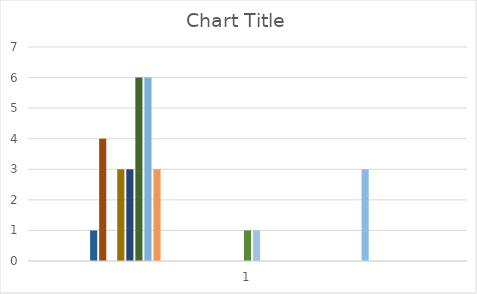
| Category | Series 0 | Series 1 | Series 2 | Series 3 | Series 4 | Series 5 | Series 6 | Series 7 | Series 8 | Series 9 | Series 10 | Series 11 | Series 12 | Series 13 | Series 14 | Series 15 | Series 16 | Series 17 | Series 18 | Series 19 | Series 20 | Series 21 | Series 22 | Series 23 | Series 24 | Series 25 | Series 26 | Series 27 | Series 28 | Series 29 | Series 30 | Series 31 | Series 32 | Series 33 | Series 34 | Series 35 | Series 36 | Series 37 | Series 38 | Series 39 | Series 40 | Series 41 | Series 42 | Series 43 | Series 44 | Series 45 | Series 46 |
|---|---|---|---|---|---|---|---|---|---|---|---|---|---|---|---|---|---|---|---|---|---|---|---|---|---|---|---|---|---|---|---|---|---|---|---|---|---|---|---|---|---|---|---|---|---|---|---|
| 0 | 0 | 0 | 0 | 0 | 0 | 0 | 1 | 4 | 0 | 3 | 3 | 6 | 6 | 3 | 0 | 0 | 0 | 0 | 0 | 0 | 0 | 0 | 0 | 1 | 1 | 0 | 0 | 0 | 0 | 0 | 0 | 0 | 0 | 0 | 0 | 0 | 3 | 0 | 0 | 0 | 0 | 0 | 0 | 0 | 0 | 0 | 0 |